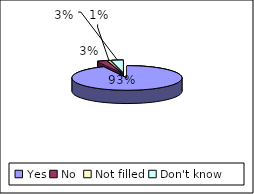
| Category | During your initial consultation with the doctor were you given information about the procedure he was planning to carry out |
|---|---|
| Yes | 134 |
| No  | 4 |
| Not filled | 1 |
| Don't know  | 5 |